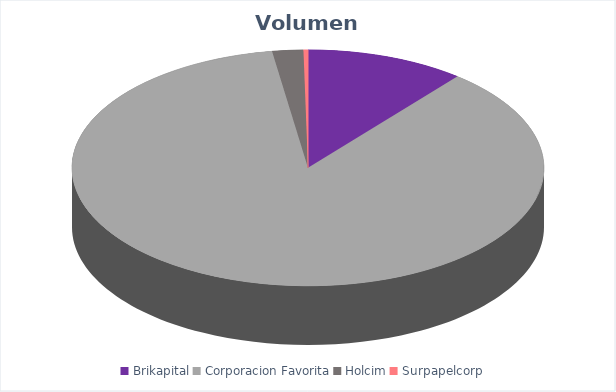
| Category | VOLUMEN ($USD) |
|---|---|
| Brikapital | 15000 |
| Corporacion Favorita | 119371.96 |
| Holcim | 2924 |
| Surpapelcorp | 425 |